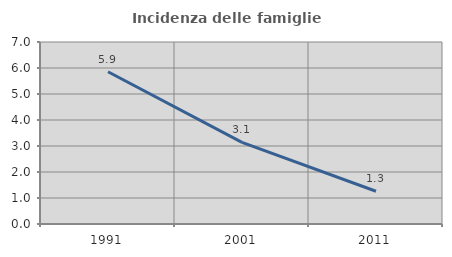
| Category | Incidenza delle famiglie numerose |
|---|---|
| 1991.0 | 5.855 |
| 2001.0 | 3.137 |
| 2011.0 | 1.259 |